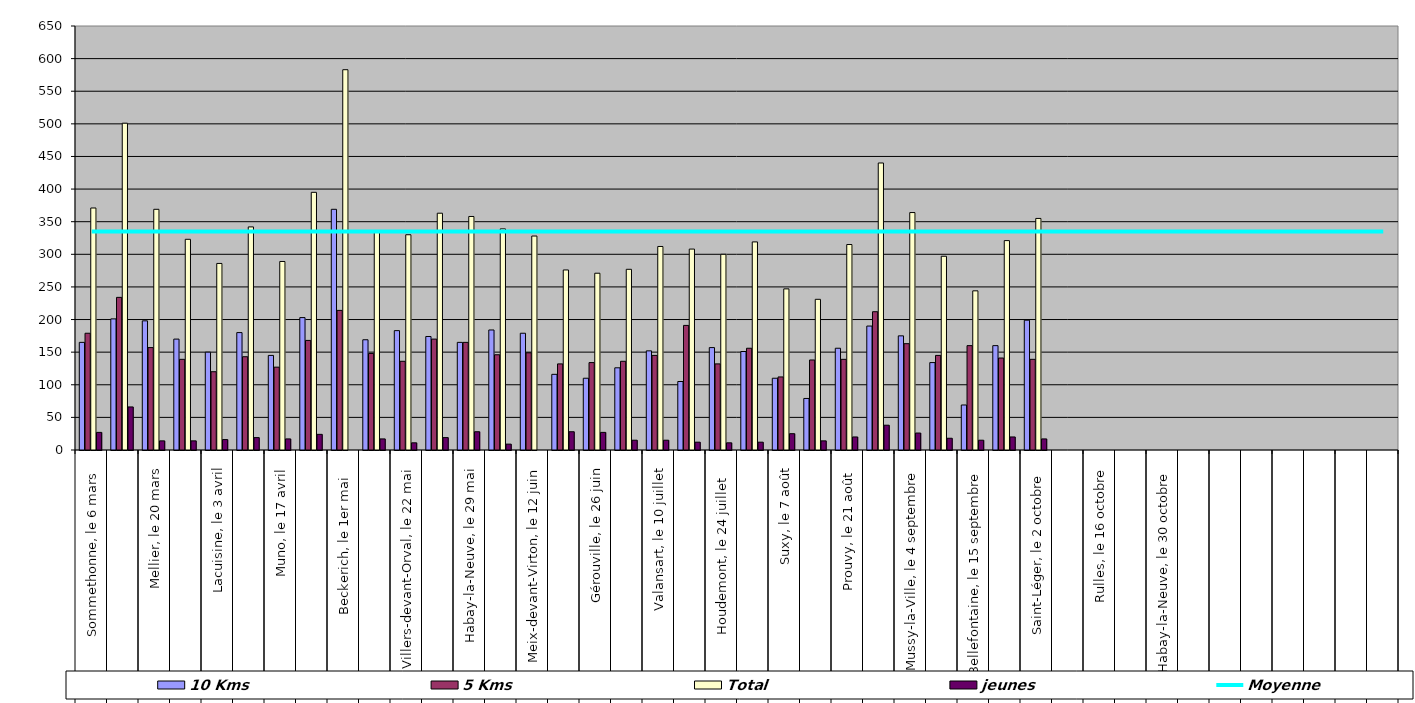
| Category | 10 Kms | 5 Kms | Total | jeunes |
|---|---|---|---|---|
| 0 | 165 | 179 | 371 | 27 |
| 1 | 201 | 234 | 501 | 66 |
| 2 | 198 | 157 | 369 | 14 |
| 3 | 170 | 139 | 323 | 14 |
| 4 | 150 | 120 | 286 | 16 |
| 5 | 180 | 143 | 342 | 19 |
| 6 | 145 | 127 | 289 | 17 |
| 7 | 203 | 168 | 395 | 24 |
| 8 | 369 | 214 | 583 | 0 |
| 9 | 169 | 148 | 334 | 17 |
| 10 | 183 | 136 | 330 | 11 |
| 11 | 174 | 170 | 363 | 19 |
| 12 | 165 | 165 | 358 | 28 |
| 13 | 184 | 146 | 339 | 9 |
| 14 | 179 | 149 | 328 | 0 |
| 15 | 116 | 132 | 276 | 28 |
| 16 | 110 | 134 | 271 | 27 |
| 17 | 126 | 136 | 277 | 15 |
| 18 | 152 | 145 | 312 | 15 |
| 19 | 105 | 191 | 308 | 12 |
| 20 | 157 | 132 | 300 | 11 |
| 21 | 151 | 156 | 319 | 12 |
| 22 | 110 | 112 | 247 | 25 |
| 23 | 79 | 138 | 231 | 14 |
| 24 | 156 | 139 | 315 | 20 |
| 25 | 190 | 212 | 440 | 38 |
| 26 | 175 | 163 | 364 | 26 |
| 27 | 134 | 145 | 297 | 18 |
| 28 | 69 | 160 | 244 | 15 |
| 29 | 160 | 141 | 321 | 20 |
| 30 | 199 | 139 | 355 | 17 |
| 31 | 0 | 0 | 0 | 0 |
| 32 | 0 | 0 | 0 | 0 |
| 33 | 0 | 0 | 0 | 0 |
| 34 | 0 | 0 | 0 | 0 |
| 35 | 0 | 0 | 0 | 0 |
| 36 | 0 | 0 | 0 | 0 |
| 37 | 0 | 0 | 0 | 0 |
| 38 | 0 | 0 | 0 | 0 |
| 39 | 0 | 0 | 0 | 0 |
| 40 | 0 | 0 | 0 | 0 |
| 41 | 0 | 0 | 0 | 0 |